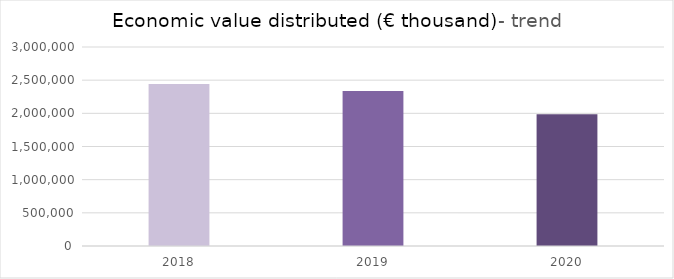
| Category | Series 0 |
|---|---|
| 2018.0 | 2440370 |
| 2019.0 | 2338379 |
| 2020.0 | 1985387 |